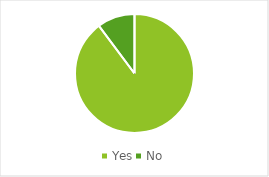
| Category | Series 0 |
|---|---|
| Yes | 88 |
| No | 10 |